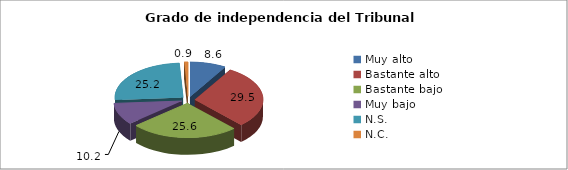
| Category | % |
|---|---|
| Muy alto | 8.6 |
| Bastante alto | 29.5 |
| Bastante bajo | 25.6 |
| Muy bajo  | 10.2 |
| N.S.  | 25.2 |
| N.C.  | 0.9 |